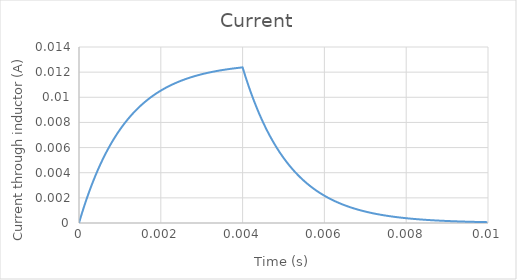
| Category | Series 0 |
|---|---|
| 0.0 | 0 |
| 1e-05 | 0 |
| 2e-05 | 0 |
| 3.0000000000000004e-05 | 0 |
| 4e-05 | 0 |
| 5e-05 | 0.001 |
| 6e-05 | 0.001 |
| 7.000000000000001e-05 | 0.001 |
| 8e-05 | 0.001 |
| 9e-05 | 0.001 |
| 0.0001 | 0.001 |
| 0.00011 | 0.001 |
| 0.00012 | 0.001 |
| 0.00013000000000000002 | 0.001 |
| 0.00014000000000000001 | 0.001 |
| 0.00015000000000000001 | 0.002 |
| 0.00016 | 0.002 |
| 0.00017 | 0.002 |
| 0.00018 | 0.002 |
| 0.00019 | 0.002 |
| 0.0002 | 0.002 |
| 0.00021 | 0.002 |
| 0.00022 | 0.002 |
| 0.00023 | 0.002 |
| 0.00024 | 0.002 |
| 0.00025 | 0.002 |
| 0.00026000000000000003 | 0.003 |
| 0.00027000000000000006 | 0.003 |
| 0.0002800000000000001 | 0.003 |
| 0.0002900000000000001 | 0.003 |
| 0.00030000000000000014 | 0.003 |
| 0.00031000000000000016 | 0.003 |
| 0.0003200000000000002 | 0.003 |
| 0.0003300000000000002 | 0.003 |
| 0.00034000000000000024 | 0.003 |
| 0.00035000000000000027 | 0.003 |
| 0.0003600000000000003 | 0.003 |
| 0.0003700000000000003 | 0.004 |
| 0.00038000000000000035 | 0.004 |
| 0.00039000000000000037 | 0.004 |
| 0.0004000000000000004 | 0.004 |
| 0.0004100000000000004 | 0.004 |
| 0.00042000000000000045 | 0.004 |
| 0.0004300000000000005 | 0.004 |
| 0.0004400000000000005 | 0.004 |
| 0.00045000000000000053 | 0.004 |
| 0.00046000000000000056 | 0.004 |
| 0.0004700000000000006 | 0.004 |
| 0.0004800000000000006 | 0.004 |
| 0.0004900000000000006 | 0.004 |
| 0.0005000000000000007 | 0.005 |
| 0.0005100000000000007 | 0.005 |
| 0.0005200000000000007 | 0.005 |
| 0.0005300000000000007 | 0.005 |
| 0.0005400000000000008 | 0.005 |
| 0.0005500000000000008 | 0.005 |
| 0.0005600000000000008 | 0.005 |
| 0.0005700000000000008 | 0.005 |
| 0.0005800000000000009 | 0.005 |
| 0.0005900000000000009 | 0.005 |
| 0.0006000000000000009 | 0.005 |
| 0.000610000000000001 | 0.005 |
| 0.000620000000000001 | 0.005 |
| 0.000630000000000001 | 0.005 |
| 0.000640000000000001 | 0.005 |
| 0.0006500000000000011 | 0.006 |
| 0.0006600000000000011 | 0.006 |
| 0.0006700000000000011 | 0.006 |
| 0.0006800000000000011 | 0.006 |
| 0.0006900000000000012 | 0.006 |
| 0.0007000000000000012 | 0.006 |
| 0.0007100000000000012 | 0.006 |
| 0.0007200000000000012 | 0.006 |
| 0.0007300000000000013 | 0.006 |
| 0.0007400000000000013 | 0.006 |
| 0.0007500000000000013 | 0.006 |
| 0.0007600000000000013 | 0.006 |
| 0.0007700000000000014 | 0.006 |
| 0.0007800000000000014 | 0.006 |
| 0.0007900000000000014 | 0.006 |
| 0.0008000000000000014 | 0.006 |
| 0.0008100000000000015 | 0.006 |
| 0.0008200000000000015 | 0.007 |
| 0.0008300000000000015 | 0.007 |
| 0.0008400000000000016 | 0.007 |
| 0.0008500000000000016 | 0.007 |
| 0.0008600000000000016 | 0.007 |
| 0.0008700000000000016 | 0.007 |
| 0.0008800000000000017 | 0.007 |
| 0.0008900000000000017 | 0.007 |
| 0.0009000000000000017 | 0.007 |
| 0.0009100000000000017 | 0.007 |
| 0.0009200000000000018 | 0.007 |
| 0.0009300000000000018 | 0.007 |
| 0.0009400000000000018 | 0.007 |
| 0.0009500000000000018 | 0.007 |
| 0.0009600000000000019 | 0.007 |
| 0.0009700000000000019 | 0.007 |
| 0.000980000000000002 | 0.007 |
| 0.000990000000000002 | 0.007 |
| 0.001000000000000002 | 0.007 |
| 0.001010000000000002 | 0.007 |
| 0.001020000000000002 | 0.008 |
| 0.001030000000000002 | 0.008 |
| 0.001040000000000002 | 0.008 |
| 0.001050000000000002 | 0.008 |
| 0.0010600000000000021 | 0.008 |
| 0.0010700000000000022 | 0.008 |
| 0.0010800000000000022 | 0.008 |
| 0.0010900000000000022 | 0.008 |
| 0.0011000000000000022 | 0.008 |
| 0.0011100000000000023 | 0.008 |
| 0.0011200000000000023 | 0.008 |
| 0.0011300000000000023 | 0.008 |
| 0.0011400000000000023 | 0.008 |
| 0.0011500000000000024 | 0.008 |
| 0.0011600000000000024 | 0.008 |
| 0.0011700000000000024 | 0.008 |
| 0.0011800000000000024 | 0.008 |
| 0.0011900000000000025 | 0.008 |
| 0.0012000000000000025 | 0.008 |
| 0.0012100000000000025 | 0.008 |
| 0.0012200000000000025 | 0.008 |
| 0.0012300000000000026 | 0.008 |
| 0.0012400000000000026 | 0.008 |
| 0.0012500000000000026 | 0.008 |
| 0.0012600000000000027 | 0.009 |
| 0.0012700000000000027 | 0.009 |
| 0.0012800000000000027 | 0.009 |
| 0.0012900000000000027 | 0.009 |
| 0.0013000000000000028 | 0.009 |
| 0.0013100000000000028 | 0.009 |
| 0.0013200000000000028 | 0.009 |
| 0.0013300000000000028 | 0.009 |
| 0.0013400000000000029 | 0.009 |
| 0.0013500000000000029 | 0.009 |
| 0.001360000000000003 | 0.009 |
| 0.001370000000000003 | 0.009 |
| 0.001380000000000003 | 0.009 |
| 0.001390000000000003 | 0.009 |
| 0.001400000000000003 | 0.009 |
| 0.001410000000000003 | 0.009 |
| 0.001420000000000003 | 0.009 |
| 0.001430000000000003 | 0.009 |
| 0.0014400000000000031 | 0.009 |
| 0.0014500000000000032 | 0.009 |
| 0.0014600000000000032 | 0.009 |
| 0.0014700000000000032 | 0.009 |
| 0.0014800000000000032 | 0.009 |
| 0.0014900000000000033 | 0.009 |
| 0.0015000000000000033 | 0.009 |
| 0.0015100000000000033 | 0.009 |
| 0.0015200000000000033 | 0.009 |
| 0.0015300000000000034 | 0.009 |
| 0.0015400000000000034 | 0.009 |
| 0.0015500000000000034 | 0.009 |
| 0.0015600000000000034 | 0.009 |
| 0.0015700000000000035 | 0.01 |
| 0.0015800000000000035 | 0.01 |
| 0.0015900000000000035 | 0.01 |
| 0.0016000000000000035 | 0.01 |
| 0.0016100000000000036 | 0.01 |
| 0.0016200000000000036 | 0.01 |
| 0.0016300000000000036 | 0.01 |
| 0.0016400000000000037 | 0.01 |
| 0.0016500000000000037 | 0.01 |
| 0.0016600000000000037 | 0.01 |
| 0.0016700000000000037 | 0.01 |
| 0.0016800000000000038 | 0.01 |
| 0.0016900000000000038 | 0.01 |
| 0.0017000000000000038 | 0.01 |
| 0.0017100000000000038 | 0.01 |
| 0.0017200000000000039 | 0.01 |
| 0.0017300000000000039 | 0.01 |
| 0.001740000000000004 | 0.01 |
| 0.001750000000000004 | 0.01 |
| 0.001760000000000004 | 0.01 |
| 0.001770000000000004 | 0.01 |
| 0.001780000000000004 | 0.01 |
| 0.001790000000000004 | 0.01 |
| 0.001800000000000004 | 0.01 |
| 0.001810000000000004 | 0.01 |
| 0.0018200000000000041 | 0.01 |
| 0.0018300000000000041 | 0.01 |
| 0.0018400000000000042 | 0.01 |
| 0.0018500000000000042 | 0.01 |
| 0.0018600000000000042 | 0.01 |
| 0.0018700000000000043 | 0.01 |
| 0.0018800000000000043 | 0.01 |
| 0.0018900000000000043 | 0.01 |
| 0.0019000000000000043 | 0.01 |
| 0.0019100000000000044 | 0.01 |
| 0.0019200000000000044 | 0.01 |
| 0.0019300000000000044 | 0.01 |
| 0.0019400000000000044 | 0.01 |
| 0.0019500000000000045 | 0.01 |
| 0.0019600000000000043 | 0.01 |
| 0.0019700000000000043 | 0.01 |
| 0.0019800000000000043 | 0.01 |
| 0.0019900000000000044 | 0.011 |
| 0.0020000000000000044 | 0.011 |
| 0.0020100000000000044 | 0.011 |
| 0.0020200000000000044 | 0.011 |
| 0.0020300000000000045 | 0.011 |
| 0.0020400000000000045 | 0.011 |
| 0.0020500000000000045 | 0.011 |
| 0.0020600000000000045 | 0.011 |
| 0.0020700000000000046 | 0.011 |
| 0.0020800000000000046 | 0.011 |
| 0.0020900000000000046 | 0.011 |
| 0.0021000000000000046 | 0.011 |
| 0.0021100000000000047 | 0.011 |
| 0.0021200000000000047 | 0.011 |
| 0.0021300000000000047 | 0.011 |
| 0.0021400000000000047 | 0.011 |
| 0.0021500000000000048 | 0.011 |
| 0.002160000000000005 | 0.011 |
| 0.002170000000000005 | 0.011 |
| 0.002180000000000005 | 0.011 |
| 0.002190000000000005 | 0.011 |
| 0.002200000000000005 | 0.011 |
| 0.002210000000000005 | 0.011 |
| 0.002220000000000005 | 0.011 |
| 0.002230000000000005 | 0.011 |
| 0.002240000000000005 | 0.011 |
| 0.002250000000000005 | 0.011 |
| 0.002260000000000005 | 0.011 |
| 0.002270000000000005 | 0.011 |
| 0.002280000000000005 | 0.011 |
| 0.002290000000000005 | 0.011 |
| 0.002300000000000005 | 0.011 |
| 0.002310000000000005 | 0.011 |
| 0.0023200000000000052 | 0.011 |
| 0.0023300000000000052 | 0.011 |
| 0.0023400000000000053 | 0.011 |
| 0.0023500000000000053 | 0.011 |
| 0.0023600000000000053 | 0.011 |
| 0.0023700000000000053 | 0.011 |
| 0.0023800000000000054 | 0.011 |
| 0.0023900000000000054 | 0.011 |
| 0.0024000000000000054 | 0.011 |
| 0.0024100000000000055 | 0.011 |
| 0.0024200000000000055 | 0.011 |
| 0.0024300000000000055 | 0.011 |
| 0.0024400000000000055 | 0.011 |
| 0.0024500000000000056 | 0.011 |
| 0.0024600000000000056 | 0.011 |
| 0.0024700000000000056 | 0.011 |
| 0.0024800000000000056 | 0.011 |
| 0.0024900000000000057 | 0.011 |
| 0.0025000000000000057 | 0.011 |
| 0.0025100000000000057 | 0.011 |
| 0.0025200000000000057 | 0.011 |
| 0.0025300000000000058 | 0.011 |
| 0.002540000000000006 | 0.011 |
| 0.002550000000000006 | 0.011 |
| 0.002560000000000006 | 0.011 |
| 0.002570000000000006 | 0.011 |
| 0.002580000000000006 | 0.011 |
| 0.002590000000000006 | 0.011 |
| 0.002600000000000006 | 0.011 |
| 0.002610000000000006 | 0.011 |
| 0.002620000000000006 | 0.011 |
| 0.002630000000000006 | 0.011 |
| 0.002640000000000006 | 0.011 |
| 0.002650000000000006 | 0.011 |
| 0.002660000000000006 | 0.012 |
| 0.002670000000000006 | 0.012 |
| 0.002680000000000006 | 0.012 |
| 0.002690000000000006 | 0.012 |
| 0.002700000000000006 | 0.012 |
| 0.0027100000000000062 | 0.012 |
| 0.0027200000000000063 | 0.012 |
| 0.0027300000000000063 | 0.012 |
| 0.0027400000000000063 | 0.012 |
| 0.0027500000000000063 | 0.012 |
| 0.0027600000000000064 | 0.012 |
| 0.0027700000000000064 | 0.012 |
| 0.0027800000000000064 | 0.012 |
| 0.0027900000000000065 | 0.012 |
| 0.0028000000000000065 | 0.012 |
| 0.0028100000000000065 | 0.012 |
| 0.0028200000000000065 | 0.012 |
| 0.0028300000000000066 | 0.012 |
| 0.0028400000000000066 | 0.012 |
| 0.0028500000000000066 | 0.012 |
| 0.0028600000000000066 | 0.012 |
| 0.0028700000000000067 | 0.012 |
| 0.0028800000000000067 | 0.012 |
| 0.0028900000000000067 | 0.012 |
| 0.0029000000000000067 | 0.012 |
| 0.0029100000000000068 | 0.012 |
| 0.002920000000000007 | 0.012 |
| 0.002930000000000007 | 0.012 |
| 0.002940000000000007 | 0.012 |
| 0.002950000000000007 | 0.012 |
| 0.002960000000000007 | 0.012 |
| 0.002970000000000007 | 0.012 |
| 0.002980000000000007 | 0.012 |
| 0.002990000000000007 | 0.012 |
| 0.003000000000000007 | 0.012 |
| 0.003010000000000007 | 0.012 |
| 0.003020000000000007 | 0.012 |
| 0.003030000000000007 | 0.012 |
| 0.003040000000000007 | 0.012 |
| 0.003050000000000007 | 0.012 |
| 0.003060000000000007 | 0.012 |
| 0.003070000000000007 | 0.012 |
| 0.003080000000000007 | 0.012 |
| 0.0030900000000000072 | 0.012 |
| 0.0031000000000000073 | 0.012 |
| 0.0031100000000000073 | 0.012 |
| 0.0031200000000000073 | 0.012 |
| 0.0031300000000000073 | 0.012 |
| 0.0031400000000000074 | 0.012 |
| 0.0031500000000000074 | 0.012 |
| 0.0031600000000000074 | 0.012 |
| 0.0031700000000000074 | 0.012 |
| 0.0031800000000000075 | 0.012 |
| 0.0031900000000000075 | 0.012 |
| 0.0032000000000000075 | 0.012 |
| 0.0032100000000000076 | 0.012 |
| 0.0032200000000000076 | 0.012 |
| 0.0032300000000000076 | 0.012 |
| 0.0032400000000000076 | 0.012 |
| 0.0032500000000000077 | 0.012 |
| 0.0032600000000000077 | 0.012 |
| 0.0032700000000000077 | 0.012 |
| 0.0032800000000000077 | 0.012 |
| 0.0032900000000000078 | 0.012 |
| 0.003300000000000008 | 0.012 |
| 0.003310000000000008 | 0.012 |
| 0.003320000000000008 | 0.012 |
| 0.003330000000000008 | 0.012 |
| 0.003340000000000008 | 0.012 |
| 0.003350000000000008 | 0.012 |
| 0.003360000000000008 | 0.012 |
| 0.003370000000000008 | 0.012 |
| 0.003380000000000008 | 0.012 |
| 0.003390000000000008 | 0.012 |
| 0.003400000000000008 | 0.012 |
| 0.003410000000000008 | 0.012 |
| 0.003420000000000008 | 0.012 |
| 0.003430000000000008 | 0.012 |
| 0.003440000000000008 | 0.012 |
| 0.003450000000000008 | 0.012 |
| 0.003460000000000008 | 0.012 |
| 0.0034700000000000082 | 0.012 |
| 0.0034800000000000083 | 0.012 |
| 0.0034900000000000083 | 0.012 |
| 0.0035000000000000083 | 0.012 |
| 0.0035100000000000083 | 0.012 |
| 0.0035200000000000084 | 0.012 |
| 0.0035300000000000084 | 0.012 |
| 0.0035400000000000084 | 0.012 |
| 0.0035500000000000084 | 0.012 |
| 0.0035600000000000085 | 0.012 |
| 0.0035700000000000085 | 0.012 |
| 0.0035800000000000085 | 0.012 |
| 0.0035900000000000085 | 0.012 |
| 0.0036000000000000086 | 0.012 |
| 0.0036100000000000086 | 0.012 |
| 0.0036200000000000086 | 0.012 |
| 0.0036300000000000087 | 0.012 |
| 0.0036400000000000087 | 0.012 |
| 0.0036500000000000087 | 0.012 |
| 0.0036600000000000087 | 0.012 |
| 0.0036700000000000088 | 0.012 |
| 0.003680000000000009 | 0.012 |
| 0.003690000000000009 | 0.012 |
| 0.003700000000000009 | 0.012 |
| 0.003710000000000009 | 0.012 |
| 0.003720000000000009 | 0.012 |
| 0.003730000000000009 | 0.012 |
| 0.003740000000000009 | 0.012 |
| 0.003750000000000009 | 0.012 |
| 0.003760000000000009 | 0.012 |
| 0.003770000000000009 | 0.012 |
| 0.003780000000000009 | 0.012 |
| 0.003790000000000009 | 0.012 |
| 0.003800000000000009 | 0.012 |
| 0.003810000000000009 | 0.012 |
| 0.003820000000000009 | 0.012 |
| 0.003830000000000009 | 0.012 |
| 0.003840000000000009 | 0.012 |
| 0.0038500000000000092 | 0.012 |
| 0.0038600000000000093 | 0.012 |
| 0.0038700000000000093 | 0.012 |
| 0.0038800000000000093 | 0.012 |
| 0.0038900000000000093 | 0.012 |
| 0.0039000000000000094 | 0.012 |
| 0.003910000000000009 | 0.012 |
| 0.0039200000000000085 | 0.012 |
| 0.003930000000000008 | 0.012 |
| 0.003940000000000008 | 0.012 |
| 0.003950000000000007 | 0.012 |
| 0.003960000000000007 | 0.012 |
| 0.0039700000000000065 | 0.012 |
| 0.003980000000000006 | 0.012 |
| 0.003990000000000006 | 0.012 |
| 0.004000000000000005 | 0.012 |
| 0.004010000000000005 | 0.012 |
| 0.0040200000000000045 | 0.012 |
| 0.004030000000000004 | 0.012 |
| 0.004040000000000004 | 0.012 |
| 0.004050000000000003 | 0.012 |
| 0.004060000000000003 | 0.012 |
| 0.0040700000000000024 | 0.012 |
| 0.004080000000000002 | 0.012 |
| 0.004090000000000002 | 0.011 |
| 0.004100000000000001 | 0.011 |
| 0.004110000000000001 | 0.011 |
| 0.00412 | 0.011 |
| 0.00413 | 0.011 |
| 0.00414 | 0.011 |
| 0.004149999999999999 | 0.011 |
| 0.004159999999999999 | 0.011 |
| 0.004169999999999998 | 0.011 |
| 0.004179999999999998 | 0.011 |
| 0.0041899999999999975 | 0.01 |
| 0.004199999999999997 | 0.01 |
| 0.004209999999999997 | 0.01 |
| 0.004219999999999996 | 0.01 |
| 0.004229999999999996 | 0.01 |
| 0.0042399999999999955 | 0.01 |
| 0.004249999999999995 | 0.01 |
| 0.004259999999999995 | 0.01 |
| 0.004269999999999994 | 0.01 |
| 0.004279999999999994 | 0.01 |
| 0.0042899999999999935 | 0.01 |
| 0.004299999999999993 | 0.01 |
| 0.004309999999999993 | 0.009 |
| 0.004319999999999992 | 0.009 |
| 0.004329999999999992 | 0.009 |
| 0.0043399999999999914 | 0.009 |
| 0.004349999999999991 | 0.009 |
| 0.004359999999999991 | 0.009 |
| 0.00436999999999999 | 0.009 |
| 0.00437999999999999 | 0.009 |
| 0.004389999999999989 | 0.009 |
| 0.004399999999999989 | 0.009 |
| 0.004409999999999989 | 0.009 |
| 0.004419999999999988 | 0.009 |
| 0.004429999999999988 | 0.009 |
| 0.004439999999999987 | 0.008 |
| 0.004449999999999987 | 0.008 |
| 0.0044599999999999865 | 0.008 |
| 0.004469999999999986 | 0.008 |
| 0.004479999999999986 | 0.008 |
| 0.004489999999999985 | 0.008 |
| 0.004499999999999985 | 0.008 |
| 0.0045099999999999845 | 0.008 |
| 0.004519999999999984 | 0.008 |
| 0.004529999999999984 | 0.008 |
| 0.004539999999999983 | 0.008 |
| 0.004549999999999983 | 0.008 |
| 0.0045599999999999825 | 0.008 |
| 0.004569999999999982 | 0.008 |
| 0.004579999999999982 | 0.007 |
| 0.004589999999999981 | 0.007 |
| 0.004599999999999981 | 0.007 |
| 0.00460999999999998 | 0.007 |
| 0.00461999999999998 | 0.007 |
| 0.00462999999999998 | 0.007 |
| 0.004639999999999979 | 0.007 |
| 0.004649999999999979 | 0.007 |
| 0.004659999999999978 | 0.007 |
| 0.004669999999999978 | 0.007 |
| 0.004679999999999978 | 0.007 |
| 0.004689999999999977 | 0.007 |
| 0.004699999999999977 | 0.007 |
| 0.004709999999999976 | 0.007 |
| 0.004719999999999976 | 0.007 |
| 0.0047299999999999755 | 0.007 |
| 0.004739999999999975 | 0.007 |
| 0.004749999999999975 | 0.006 |
| 0.004759999999999974 | 0.006 |
| 0.004769999999999974 | 0.006 |
| 0.0047799999999999735 | 0.006 |
| 0.004789999999999973 | 0.006 |
| 0.004799999999999973 | 0.006 |
| 0.004809999999999972 | 0.006 |
| 0.004819999999999972 | 0.006 |
| 0.0048299999999999715 | 0.006 |
| 0.004839999999999971 | 0.006 |
| 0.004849999999999971 | 0.006 |
| 0.00485999999999997 | 0.006 |
| 0.00486999999999997 | 0.006 |
| 0.004879999999999969 | 0.006 |
| 0.004889999999999969 | 0.006 |
| 0.004899999999999969 | 0.006 |
| 0.004909999999999968 | 0.006 |
| 0.004919999999999968 | 0.006 |
| 0.004929999999999967 | 0.006 |
| 0.004939999999999967 | 0.005 |
| 0.004949999999999967 | 0.005 |
| 0.004959999999999966 | 0.005 |
| 0.004969999999999966 | 0.005 |
| 0.004979999999999965 | 0.005 |
| 0.004989999999999965 | 0.005 |
| 0.0049999999999999645 | 0.005 |
| 0.005009999999999964 | 0.005 |
| 0.005019999999999964 | 0.005 |
| 0.005029999999999963 | 0.005 |
| 0.005039999999999963 | 0.005 |
| 0.0050499999999999625 | 0.005 |
| 0.005059999999999962 | 0.005 |
| 0.005069999999999962 | 0.005 |
| 0.005079999999999961 | 0.005 |
| 0.005089999999999961 | 0.005 |
| 0.0050999999999999605 | 0.005 |
| 0.00510999999999996 | 0.005 |
| 0.00511999999999996 | 0.005 |
| 0.005129999999999959 | 0.005 |
| 0.005139999999999959 | 0.005 |
| 0.005149999999999958 | 0.005 |
| 0.005159999999999958 | 0.005 |
| 0.005169999999999958 | 0.004 |
| 0.005179999999999957 | 0.004 |
| 0.005189999999999957 | 0.004 |
| 0.005199999999999956 | 0.004 |
| 0.005209999999999956 | 0.004 |
| 0.005219999999999956 | 0.004 |
| 0.005229999999999955 | 0.004 |
| 0.005239999999999955 | 0.004 |
| 0.005249999999999954 | 0.004 |
| 0.005259999999999954 | 0.004 |
| 0.0052699999999999535 | 0.004 |
| 0.005279999999999953 | 0.004 |
| 0.005289999999999953 | 0.004 |
| 0.005299999999999952 | 0.004 |
| 0.005309999999999952 | 0.004 |
| 0.0053199999999999515 | 0.004 |
| 0.005329999999999951 | 0.004 |
| 0.005339999999999951 | 0.004 |
| 0.00534999999999995 | 0.004 |
| 0.00535999999999995 | 0.004 |
| 0.0053699999999999495 | 0.004 |
| 0.005379999999999949 | 0.004 |
| 0.005389999999999949 | 0.004 |
| 0.005399999999999948 | 0.004 |
| 0.005409999999999948 | 0.004 |
| 0.005419999999999947 | 0.004 |
| 0.005429999999999947 | 0.004 |
| 0.005439999999999947 | 0.004 |
| 0.005449999999999946 | 0.004 |
| 0.005459999999999946 | 0.003 |
| 0.005469999999999945 | 0.003 |
| 0.005479999999999945 | 0.003 |
| 0.005489999999999945 | 0.003 |
| 0.005499999999999944 | 0.003 |
| 0.005509999999999944 | 0.003 |
| 0.005519999999999943 | 0.003 |
| 0.005529999999999943 | 0.003 |
| 0.0055399999999999425 | 0.003 |
| 0.005549999999999942 | 0.003 |
| 0.005559999999999942 | 0.003 |
| 0.005569999999999941 | 0.003 |
| 0.005579999999999941 | 0.003 |
| 0.0055899999999999405 | 0.003 |
| 0.00559999999999994 | 0.003 |
| 0.00560999999999994 | 0.003 |
| 0.005619999999999939 | 0.003 |
| 0.005629999999999939 | 0.003 |
| 0.0056399999999999385 | 0.003 |
| 0.005649999999999938 | 0.003 |
| 0.005659999999999938 | 0.003 |
| 0.005669999999999937 | 0.003 |
| 0.005679999999999937 | 0.003 |
| 0.005689999999999936 | 0.003 |
| 0.005699999999999936 | 0.003 |
| 0.005709999999999936 | 0.003 |
| 0.005719999999999935 | 0.003 |
| 0.005729999999999935 | 0.003 |
| 0.005739999999999934 | 0.003 |
| 0.005749999999999934 | 0.003 |
| 0.005759999999999934 | 0.003 |
| 0.005769999999999933 | 0.003 |
| 0.005779999999999933 | 0.003 |
| 0.005789999999999932 | 0.003 |
| 0.005799999999999932 | 0.003 |
| 0.0058099999999999315 | 0.003 |
| 0.005819999999999931 | 0.003 |
| 0.005829999999999931 | 0.003 |
| 0.00583999999999993 | 0.002 |
| 0.00584999999999993 | 0.002 |
| 0.0058599999999999295 | 0.002 |
| 0.005869999999999929 | 0.002 |
| 0.005879999999999929 | 0.002 |
| 0.005889999999999928 | 0.002 |
| 0.005899999999999928 | 0.002 |
| 0.0059099999999999275 | 0.002 |
| 0.005919999999999927 | 0.002 |
| 0.005929999999999927 | 0.002 |
| 0.005939999999999926 | 0.002 |
| 0.005949999999999926 | 0.002 |
| 0.005959999999999925 | 0.002 |
| 0.005969999999999925 | 0.002 |
| 0.005979999999999925 | 0.002 |
| 0.005989999999999924 | 0.002 |
| 0.005999999999999924 | 0.002 |
| 0.006009999999999923 | 0.002 |
| 0.006019999999999923 | 0.002 |
| 0.006029999999999923 | 0.002 |
| 0.006039999999999922 | 0.002 |
| 0.006049999999999922 | 0.002 |
| 0.006059999999999921 | 0.002 |
| 0.006069999999999921 | 0.002 |
| 0.0060799999999999205 | 0.002 |
| 0.00608999999999992 | 0.002 |
| 0.00609999999999992 | 0.002 |
| 0.006109999999999919 | 0.002 |
| 0.006119999999999919 | 0.002 |
| 0.0061299999999999185 | 0.002 |
| 0.006139999999999918 | 0.002 |
| 0.006149999999999918 | 0.002 |
| 0.006159999999999917 | 0.002 |
| 0.006169999999999917 | 0.002 |
| 0.0061799999999999165 | 0.002 |
| 0.006189999999999916 | 0.002 |
| 0.006199999999999916 | 0.002 |
| 0.006209999999999915 | 0.002 |
| 0.006219999999999915 | 0.002 |
| 0.006229999999999914 | 0.002 |
| 0.006239999999999914 | 0.002 |
| 0.006249999999999914 | 0.002 |
| 0.006259999999999913 | 0.002 |
| 0.006269999999999913 | 0.002 |
| 0.006279999999999912 | 0.002 |
| 0.006289999999999912 | 0.002 |
| 0.006299999999999912 | 0.002 |
| 0.006309999999999911 | 0.002 |
| 0.006319999999999911 | 0.002 |
| 0.00632999999999991 | 0.002 |
| 0.00633999999999991 | 0.002 |
| 0.0063499999999999095 | 0.002 |
| 0.006359999999999909 | 0.002 |
| 0.006369999999999909 | 0.002 |
| 0.006379999999999908 | 0.002 |
| 0.006389999999999908 | 0.002 |
| 0.0063999999999999075 | 0.002 |
| 0.006409999999999907 | 0.002 |
| 0.006419999999999907 | 0.002 |
| 0.006429999999999906 | 0.001 |
| 0.006439999999999906 | 0.001 |
| 0.0064499999999999055 | 0.001 |
| 0.006459999999999905 | 0.001 |
| 0.006469999999999905 | 0.001 |
| 0.006479999999999904 | 0.001 |
| 0.006489999999999904 | 0.001 |
| 0.006499999999999903 | 0.001 |
| 0.006509999999999903 | 0.001 |
| 0.006519999999999903 | 0.001 |
| 0.006529999999999902 | 0.001 |
| 0.006539999999999902 | 0.001 |
| 0.006549999999999901 | 0.001 |
| 0.006559999999999901 | 0.001 |
| 0.006569999999999901 | 0.001 |
| 0.0065799999999999 | 0.001 |
| 0.0065899999999999 | 0.001 |
| 0.006599999999999899 | 0.001 |
| 0.006609999999999899 | 0.001 |
| 0.0066199999999998985 | 0.001 |
| 0.006629999999999898 | 0.001 |
| 0.006639999999999898 | 0.001 |
| 0.006649999999999897 | 0.001 |
| 0.006659999999999897 | 0.001 |
| 0.0066699999999998965 | 0.001 |
| 0.006679999999999896 | 0.001 |
| 0.006689999999999896 | 0.001 |
| 0.006699999999999895 | 0.001 |
| 0.006709999999999895 | 0.001 |
| 0.0067199999999998945 | 0.001 |
| 0.006729999999999894 | 0.001 |
| 0.006739999999999894 | 0.001 |
| 0.006749999999999893 | 0.001 |
| 0.006759999999999893 | 0.001 |
| 0.006769999999999892 | 0.001 |
| 0.006779999999999892 | 0.001 |
| 0.006789999999999892 | 0.001 |
| 0.006799999999999891 | 0.001 |
| 0.006809999999999891 | 0.001 |
| 0.00681999999999989 | 0.001 |
| 0.00682999999999989 | 0.001 |
| 0.00683999999999989 | 0.001 |
| 0.006849999999999889 | 0.001 |
| 0.006859999999999889 | 0.001 |
| 0.006869999999999888 | 0.001 |
| 0.006879999999999888 | 0.001 |
| 0.0068899999999998875 | 0.001 |
| 0.006899999999999887 | 0.001 |
| 0.006909999999999887 | 0.001 |
| 0.006919999999999886 | 0.001 |
| 0.006929999999999886 | 0.001 |
| 0.0069399999999998855 | 0.001 |
| 0.006949999999999885 | 0.001 |
| 0.006959999999999885 | 0.001 |
| 0.006969999999999884 | 0.001 |
| 0.006979999999999884 | 0.001 |
| 0.0069899999999998835 | 0.001 |
| 0.006999999999999883 | 0.001 |
| 0.007009999999999883 | 0.001 |
| 0.007019999999999882 | 0.001 |
| 0.007029999999999882 | 0.001 |
| 0.007039999999999881 | 0.001 |
| 0.007049999999999881 | 0.001 |
| 0.007059999999999881 | 0.001 |
| 0.00706999999999988 | 0.001 |
| 0.00707999999999988 | 0.001 |
| 0.007089999999999879 | 0.001 |
| 0.007099999999999879 | 0.001 |
| 0.007109999999999879 | 0.001 |
| 0.007119999999999878 | 0.001 |
| 0.007129999999999878 | 0.001 |
| 0.007139999999999877 | 0.001 |
| 0.007149999999999877 | 0.001 |
| 0.0071599999999998765 | 0.001 |
| 0.007169999999999876 | 0.001 |
| 0.007179999999999876 | 0.001 |
| 0.007189999999999875 | 0.001 |
| 0.007199999999999875 | 0.001 |
| 0.0072099999999998745 | 0.001 |
| 0.007219999999999874 | 0.001 |
| 0.007229999999999874 | 0.001 |
| 0.007239999999999873 | 0.001 |
| 0.007249999999999873 | 0.001 |
| 0.0072599999999998725 | 0.001 |
| 0.007269999999999872 | 0.001 |
| 0.007279999999999872 | 0.001 |
| 0.007289999999999871 | 0.001 |
| 0.007299999999999871 | 0.001 |
| 0.00730999999999987 | 0.001 |
| 0.00731999999999987 | 0.001 |
| 0.00732999999999987 | 0.001 |
| 0.007339999999999869 | 0.001 |
| 0.007349999999999869 | 0.001 |
| 0.007359999999999868 | 0.001 |
| 0.007369999999999868 | 0.001 |
| 0.007379999999999868 | 0.001 |
| 0.007389999999999867 | 0.001 |
| 0.007399999999999867 | 0.001 |
| 0.007409999999999866 | 0.001 |
| 0.007419999999999866 | 0.001 |
| 0.0074299999999998655 | 0.001 |
| 0.007439999999999865 | 0.001 |
| 0.007449999999999865 | 0.001 |
| 0.007459999999999864 | 0.001 |
| 0.007469999999999864 | 0.001 |
| 0.0074799999999998635 | 0.001 |
| 0.007489999999999863 | 0.001 |
| 0.007499999999999863 | 0.001 |
| 0.007509999999999862 | 0.001 |
| 0.007519999999999862 | 0.001 |
| 0.0075299999999998615 | 0.001 |
| 0.007539999999999861 | 0.001 |
| 0.007549999999999861 | 0.001 |
| 0.00755999999999986 | 0.001 |
| 0.00756999999999986 | 0.001 |
| 0.007579999999999859 | 0.001 |
| 0.007589999999999859 | 0.001 |
| 0.007599999999999859 | 0.001 |
| 0.007609999999999858 | 0.001 |
| 0.007619999999999858 | 0.001 |
| 0.007629999999999857 | 0.001 |
| 0.007639999999999857 | 0.001 |
| 0.007649999999999857 | 0.001 |
| 0.007659999999999856 | 0.001 |
| 0.007669999999999856 | 0.001 |
| 0.007679999999999855 | 0.001 |
| 0.007689999999999855 | 0 |
| 0.0076999999999998545 | 0 |
| 0.007709999999999854 | 0 |
| 0.007719999999999854 | 0 |
| 0.007729999999999853 | 0 |
| 0.007739999999999853 | 0 |
| 0.0077499999999998525 | 0 |
| 0.007759999999999852 | 0 |
| 0.007769999999999852 | 0 |
| 0.007779999999999851 | 0 |
| 0.007789999999999851 | 0 |
| 0.0077999999999998505 | 0 |
| 0.00780999999999985 | 0 |
| 0.00781999999999985 | 0 |
| 0.00782999999999985 | 0 |
| 0.007839999999999849 | 0 |
| 0.007849999999999848 | 0 |
| 0.007859999999999848 | 0 |
| 0.007869999999999848 | 0 |
| 0.007879999999999847 | 0 |
| 0.007889999999999847 | 0 |
| 0.007899999999999846 | 0 |
| 0.007909999999999846 | 0 |
| 0.007919999999999846 | 0 |
| 0.007929999999999845 | 0 |
| 0.007939999999999845 | 0 |
| 0.007949999999999844 | 0 |
| 0.007959999999999844 | 0 |
| 0.007969999999999844 | 0 |
| 0.007979999999999843 | 0 |
| 0.007989999999999843 | 0 |
| 0.007999999999999842 | 0 |
| 0.008009999999999842 | 0 |
| 0.008019999999999841 | 0 |
| 0.008029999999999841 | 0 |
| 0.00803999999999984 | 0 |
| 0.00804999999999984 | 0 |
| 0.00805999999999984 | 0 |
| 0.00806999999999984 | 0 |
| 0.008079999999999839 | 0 |
| 0.008089999999999839 | 0 |
| 0.008099999999999838 | 0 |
| 0.008109999999999838 | 0 |
| 0.008119999999999837 | 0 |
| 0.008129999999999837 | 0 |
| 0.008139999999999837 | 0 |
| 0.008149999999999836 | 0 |
| 0.008159999999999836 | 0 |
| 0.008169999999999835 | 0 |
| 0.008179999999999835 | 0 |
| 0.008189999999999835 | 0 |
| 0.008199999999999834 | 0 |
| 0.008209999999999834 | 0 |
| 0.008219999999999833 | 0 |
| 0.008229999999999833 | 0 |
| 0.008239999999999833 | 0 |
| 0.008249999999999832 | 0 |
| 0.008259999999999832 | 0 |
| 0.008269999999999831 | 0 |
| 0.008279999999999831 | 0 |
| 0.00828999999999983 | 0 |
| 0.00829999999999983 | 0 |
| 0.00830999999999983 | 0 |
| 0.00831999999999983 | 0 |
| 0.008329999999999829 | 0 |
| 0.008339999999999828 | 0 |
| 0.008349999999999828 | 0 |
| 0.008359999999999828 | 0 |
| 0.008369999999999827 | 0 |
| 0.008379999999999827 | 0 |
| 0.008389999999999826 | 0 |
| 0.008399999999999826 | 0 |
| 0.008409999999999826 | 0 |
| 0.008419999999999825 | 0 |
| 0.008429999999999825 | 0 |
| 0.008439999999999824 | 0 |
| 0.008449999999999824 | 0 |
| 0.008459999999999824 | 0 |
| 0.008469999999999823 | 0 |
| 0.008479999999999823 | 0 |
| 0.008489999999999822 | 0 |
| 0.008499999999999822 | 0 |
| 0.008509999999999822 | 0 |
| 0.008519999999999821 | 0 |
| 0.00852999999999982 | 0 |
| 0.00853999999999982 | 0 |
| 0.00854999999999982 | 0 |
| 0.00855999999999982 | 0 |
| 0.008569999999999819 | 0 |
| 0.008579999999999819 | 0 |
| 0.008589999999999818 | 0 |
| 0.008599999999999818 | 0 |
| 0.008609999999999817 | 0 |
| 0.008619999999999817 | 0 |
| 0.008629999999999817 | 0 |
| 0.008639999999999816 | 0 |
| 0.008649999999999816 | 0 |
| 0.008659999999999815 | 0 |
| 0.008669999999999815 | 0 |
| 0.008679999999999815 | 0 |
| 0.008689999999999814 | 0 |
| 0.008699999999999814 | 0 |
| 0.008709999999999813 | 0 |
| 0.008719999999999813 | 0 |
| 0.008729999999999813 | 0 |
| 0.008739999999999812 | 0 |
| 0.008749999999999812 | 0 |
| 0.008759999999999811 | 0 |
| 0.008769999999999811 | 0 |
| 0.00877999999999981 | 0 |
| 0.00878999999999981 | 0 |
| 0.00879999999999981 | 0 |
| 0.00880999999999981 | 0 |
| 0.008819999999999809 | 0 |
| 0.008829999999999808 | 0 |
| 0.008839999999999808 | 0 |
| 0.008849999999999808 | 0 |
| 0.008859999999999807 | 0 |
| 0.008869999999999807 | 0 |
| 0.008879999999999806 | 0 |
| 0.008889999999999806 | 0 |
| 0.008899999999999806 | 0 |
| 0.008909999999999805 | 0 |
| 0.008919999999999805 | 0 |
| 0.008929999999999804 | 0 |
| 0.008939999999999804 | 0 |
| 0.008949999999999804 | 0 |
| 0.008959999999999803 | 0 |
| 0.008969999999999803 | 0 |
| 0.008979999999999802 | 0 |
| 0.008989999999999802 | 0 |
| 0.008999999999999802 | 0 |
| 0.009009999999999801 | 0 |
| 0.0090199999999998 | 0 |
| 0.0090299999999998 | 0 |
| 0.0090399999999998 | 0 |
| 0.0090499999999998 | 0 |
| 0.009059999999999799 | 0 |
| 0.009069999999999799 | 0 |
| 0.009079999999999798 | 0 |
| 0.009089999999999798 | 0 |
| 0.009099999999999797 | 0 |
| 0.009109999999999797 | 0 |
| 0.009119999999999797 | 0 |
| 0.009129999999999796 | 0 |
| 0.009139999999999796 | 0 |
| 0.009149999999999795 | 0 |
| 0.009159999999999795 | 0 |
| 0.009169999999999795 | 0 |
| 0.009179999999999794 | 0 |
| 0.009189999999999794 | 0 |
| 0.009199999999999793 | 0 |
| 0.009209999999999793 | 0 |
| 0.009219999999999793 | 0 |
| 0.009229999999999792 | 0 |
| 0.009239999999999792 | 0 |
| 0.009249999999999791 | 0 |
| 0.009259999999999791 | 0 |
| 0.00926999999999979 | 0 |
| 0.00927999999999979 | 0 |
| 0.00928999999999979 | 0 |
| 0.00929999999999979 | 0 |
| 0.009309999999999789 | 0 |
| 0.009319999999999789 | 0 |
| 0.009329999999999788 | 0 |
| 0.009339999999999788 | 0 |
| 0.009349999999999787 | 0 |
| 0.009359999999999787 | 0 |
| 0.009369999999999786 | 0 |
| 0.009379999999999786 | 0 |
| 0.009389999999999786 | 0 |
| 0.009399999999999785 | 0 |
| 0.009409999999999785 | 0 |
| 0.009419999999999784 | 0 |
| 0.009429999999999784 | 0 |
| 0.009439999999999784 | 0 |
| 0.009449999999999783 | 0 |
| 0.009459999999999783 | 0 |
| 0.009469999999999782 | 0 |
| 0.009479999999999782 | 0 |
| 0.009489999999999782 | 0 |
| 0.009499999999999781 | 0 |
| 0.00950999999999978 | 0 |
| 0.00951999999999978 | 0 |
| 0.00952999999999978 | 0 |
| 0.00953999999999978 | 0 |
| 0.00954999999999978 | 0 |
| 0.009559999999999779 | 0 |
| 0.009569999999999778 | 0 |
| 0.009579999999999778 | 0 |
| 0.009589999999999778 | 0 |
| 0.009599999999999777 | 0 |
| 0.009609999999999777 | 0 |
| 0.009619999999999776 | 0 |
| 0.009629999999999776 | 0 |
| 0.009639999999999775 | 0 |
| 0.009649999999999775 | 0 |
| 0.009659999999999775 | 0 |
| 0.009669999999999774 | 0 |
| 0.009679999999999774 | 0 |
| 0.009689999999999773 | 0 |
| 0.009699999999999773 | 0 |
| 0.009709999999999773 | 0 |
| 0.009719999999999772 | 0 |
| 0.009729999999999772 | 0 |
| 0.009739999999999771 | 0 |
| 0.009749999999999771 | 0 |
| 0.00975999999999977 | 0 |
| 0.00976999999999977 | 0 |
| 0.00977999999999977 | 0 |
| 0.00978999999999977 | 0 |
| 0.009799999999999769 | 0 |
| 0.009809999999999769 | 0 |
| 0.009819999999999768 | 0 |
| 0.009829999999999768 | 0 |
| 0.009839999999999767 | 0 |
| 0.009849999999999767 | 0 |
| 0.009859999999999767 | 0 |
| 0.009869999999999766 | 0 |
| 0.009879999999999766 | 0 |
| 0.009889999999999765 | 0 |
| 0.009899999999999765 | 0 |
| 0.009909999999999764 | 0 |
| 0.009919999999999764 | 0 |
| 0.009929999999999764 | 0 |
| 0.009939999999999763 | 0 |
| 0.009949999999999763 | 0 |
| 0.009959999999999762 | 0 |
| 0.009969999999999762 | 0 |
| 0.009979999999999762 | 0 |